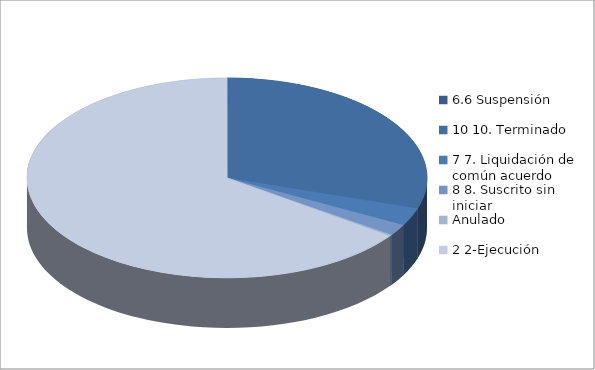
| Category | Series 0 |
|---|---|
| 6.6 Suspensión | 1 |
| 10 10. Terminado | 262 |
| 7 7. Liquidación de común acuerdo | 25 |
| 8 8. Suscrito sin iniciar | 16 |
| Anulado | 2 |
| 2 2-Ejecución | 572 |